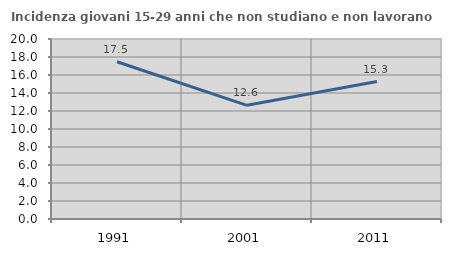
| Category | Incidenza giovani 15-29 anni che non studiano e non lavorano  |
|---|---|
| 1991.0 | 17.468 |
| 2001.0 | 12.629 |
| 2011.0 | 15.277 |